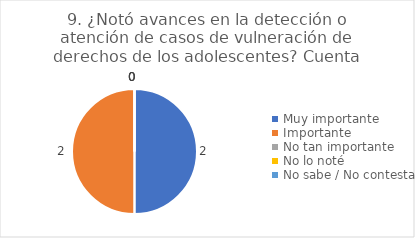
| Category | 9. ¿Notó avances en la detección o atención de casos de vulneración de derechos de los adolescentes? |
|---|---|
| Muy importante  | 0.5 |
| Importante  | 0.5 |
| No tan importante  | 0 |
| No lo noté  | 0 |
| No sabe / No contesta | 0 |